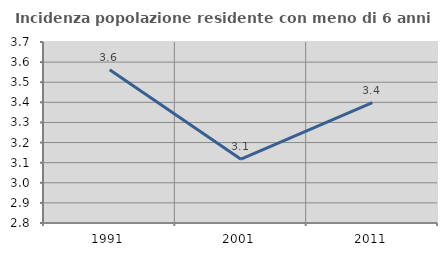
| Category | Incidenza popolazione residente con meno di 6 anni |
|---|---|
| 1991.0 | 3.562 |
| 2001.0 | 3.117 |
| 2011.0 | 3.398 |